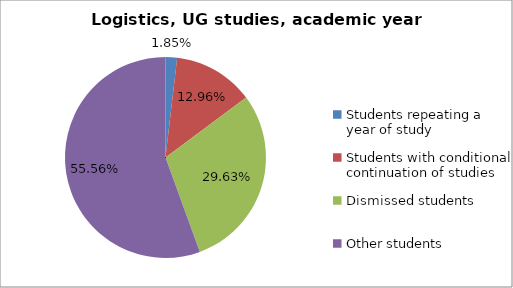
| Category | Series 0 |
|---|---|
| Students repeating a year of study | 1 |
| Students with conditional continuation of studies | 7 |
| Dismissed students | 16 |
| Other students | 30 |